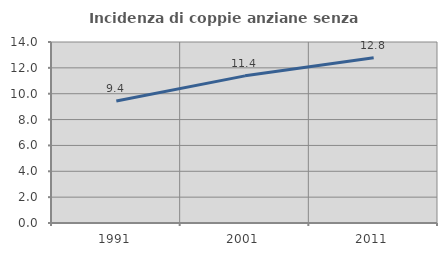
| Category | Incidenza di coppie anziane senza figli  |
|---|---|
| 1991.0 | 9.434 |
| 2001.0 | 11.381 |
| 2011.0 | 12.775 |